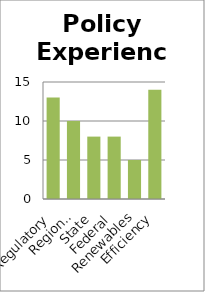
| Category | Policy Experience |
|---|---|
| Regulatory | 13 |
| Regional | 10 |
| State | 8 |
| Federal | 8 |
| Renewables | 5 |
| Efficiency | 14 |